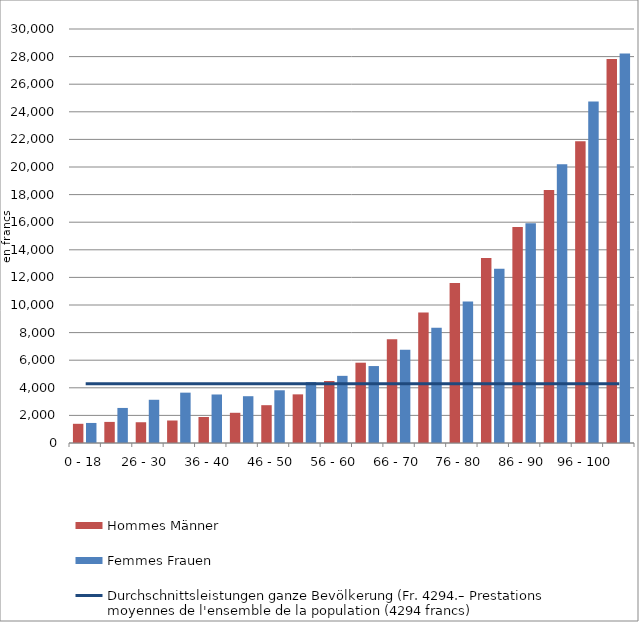
| Category | Hommes | Femmes |
|---|---|---|
| 0 - 18 | 1391.583 | 1452.652 |
| 19 - 25 | 1528.353 | 2540.361 |
| 26 - 30 | 1504.659 | 3132.131 |
| 31 - 35 | 1630.186 | 3648.736 |
| 36 - 40 | 1885.925 | 3515.583 |
| 41 - 45 | 2189.491 | 3390.627 |
| 46 - 50 | 2740.25 | 3819.748 |
| 51 - 55 | 3525.082 | 4415.382 |
| 56 - 60 | 4493.761 | 4866.676 |
| 61 - 65 | 5819.102 | 5575.921 |
| 66 - 70 | 7509.301 | 6765.981 |
| 71 - 75 | 9457.34 | 8348.924 |
| 76 - 80 | 11588.088 | 10250.036 |
| 81 - 85 | 13412.219 | 12635.137 |
| 86 - 90 | 15646.692 | 15926.133 |
| 91 -95 | 18324.906 | 20205.881 |
| 96 - 100 | 21861.188 | 24742.065 |
| > 100 | 27833.282 | 28220.66 |